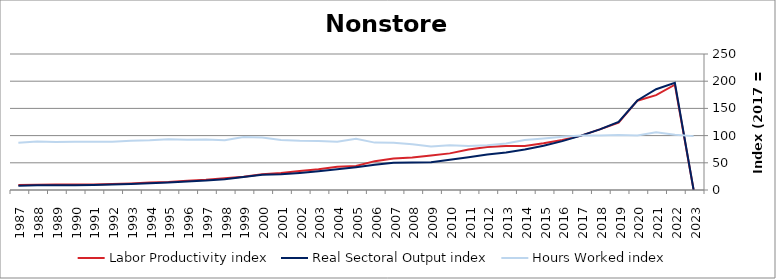
| Category | Labor Productivity index | Real Sectoral Output index | Hours Worked index |
|---|---|---|---|
| 2023.0 | 0 | 0 | 99.035 |
| 2022.0 | 193.514 | 196.944 | 101.773 |
| 2021.0 | 174.455 | 185.282 | 106.206 |
| 2020.0 | 164.143 | 164.55 | 100.248 |
| 2019.0 | 123.829 | 124.97 | 100.921 |
| 2018.0 | 111.42 | 111.458 | 100.034 |
| 2017.0 | 100 | 100 | 100 |
| 2016.0 | 91.934 | 89.851 | 97.734 |
| 2015.0 | 85.908 | 81.425 | 94.782 |
| 2014.0 | 81.071 | 74.339 | 91.697 |
| 2013.0 | 80.973 | 69.101 | 85.338 |
| 2012.0 | 79.223 | 65.165 | 82.256 |
| 2011.0 | 74.261 | 60.093 | 80.921 |
| 2010.0 | 67.312 | 55.507 | 82.461 |
| 2009.0 | 63.57 | 50.967 | 80.175 |
| 2008.0 | 59.93 | 50.34 | 83.998 |
| 2007.0 | 57.753 | 50.09 | 86.731 |
| 2006.0 | 53.033 | 46.202 | 87.12 |
| 2005.0 | 44.306 | 41.796 | 94.335 |
| 2004.0 | 42.936 | 38.063 | 88.651 |
| 2003.0 | 38.228 | 34.513 | 90.281 |
| 2002.0 | 34.789 | 31.422 | 90.322 |
| 2001.0 | 31.294 | 28.823 | 92.103 |
| 2000.0 | 29.014 | 27.955 | 96.35 |
| 1999.0 | 24.323 | 23.717 | 97.51 |
| 1998.0 | 21.624 | 19.78 | 91.474 |
| 1997.0 | 18.713 | 17.361 | 92.774 |
| 1996.0 | 17.067 | 15.765 | 92.371 |
| 1995.0 | 14.806 | 13.84 | 93.471 |
| 1994.0 | 13.7 | 12.538 | 91.512 |
| 1993.0 | 12.134 | 10.966 | 90.373 |
| 1992.0 | 11.201 | 9.934 | 88.692 |
| 1991.0 | 10.236 | 9.102 | 88.915 |
| 1990.0 | 9.973 | 8.841 | 88.65 |
| 1989.0 | 10.049 | 8.875 | 88.326 |
| 1988.0 | 9.658 | 8.617 | 89.219 |
| 1987.0 | 9.237 | 8.03 | 86.931 |